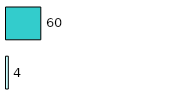
| Category | Series 0 | Series 1 |
|---|---|---|
| 0 | 4 | 60 |